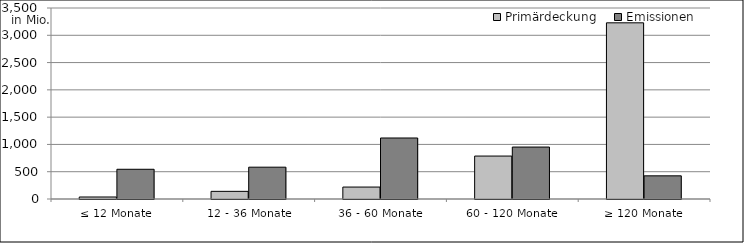
| Category | Primärdeckung | Emissionen |
|---|---|---|
| ≤ 12 Monate | 36804686.158 | 544830197.37 |
| 12 - 36 Monate | 140065798.111 | 583150000 |
| 36 - 60 Monate | 218889549.121 | 1118000000 |
| 60 - 120 Monate | 786839301.92 | 952000000 |
| ≥ 120 Monate | 3228517110.42 | 424352789.19 |